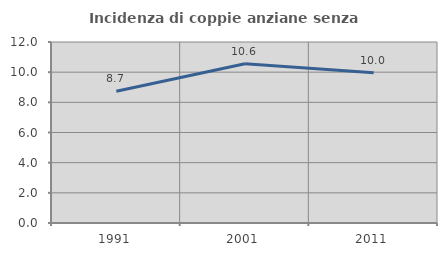
| Category | Incidenza di coppie anziane senza figli  |
|---|---|
| 1991.0 | 8.729 |
| 2001.0 | 10.561 |
| 2011.0 | 9.954 |